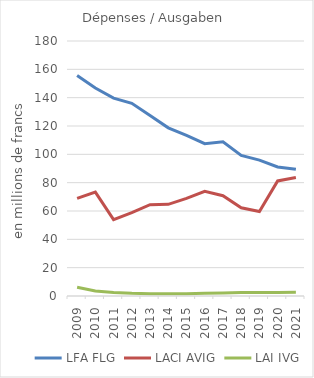
| Category | LFA | LACI | LAI |
|---|---|---|---|
| 2009 | 155.695 | 68.943 | 6.13 |
| 2010 | 146.83 | 73.37 | 3.485 |
| 2011 | 139.68 | 53.892 | 2.418 |
| 2012 | 135.989 | 58.816 | 1.864 |
| 2013 | 127.369 | 64.449 | 1.631 |
| 2014 | 118.705 | 64.68 | 1.627 |
| 2015 | 113.31 | 68.859 | 1.612 |
| 2016 | 107.536 | 73.9 | 1.964 |
| 2017 | 108.877 | 70.785 | 2.093 |
| 2018 | 99.182 | 62.302 | 2.397 |
| 2019 | 95.935 | 59.61 | 2.399 |
| 2020 | 91.073 | 81.239 | 2.5 |
| 2021 | 89.416 | 83.685 | 2.561 |